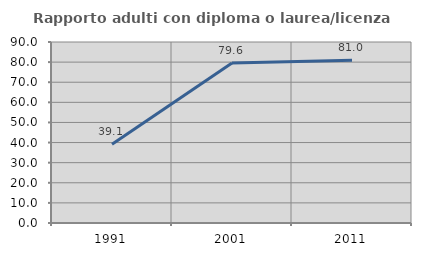
| Category | Rapporto adulti con diploma o laurea/licenza media  |
|---|---|
| 1991.0 | 39.13 |
| 2001.0 | 79.592 |
| 2011.0 | 80.952 |